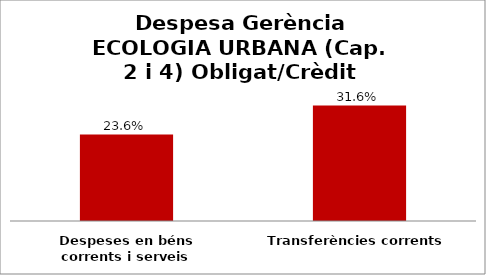
| Category | Series 0 |
|---|---|
| Despeses en béns corrents i serveis | 0.236 |
| Transferències corrents | 0.316 |